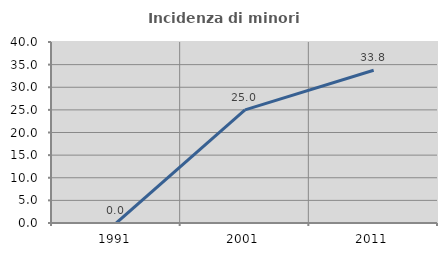
| Category | Incidenza di minori stranieri |
|---|---|
| 1991.0 | 0 |
| 2001.0 | 25 |
| 2011.0 | 33.75 |